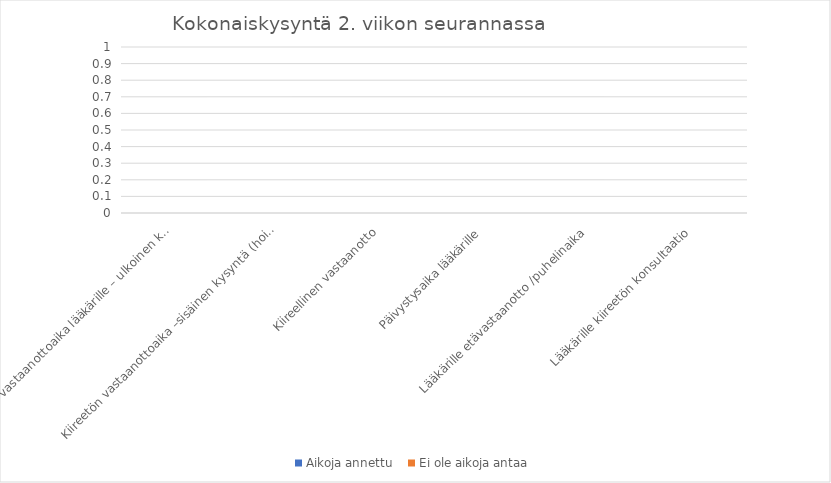
| Category | Aikoja annettu  | Ei ole aikoja antaa |
|---|---|---|
| Kiireetön vastaanottoaika lääkärille – ulkoinen kysyntä (hta:sta varattu aika) | 0 | 0 |
| Kiireetön vastaanottoaika –sisäinen kysyntä (hoitajan vastaanotolta/jatkokäynti) | 0 | 0 |
| Kiireellinen vastaanotto | 0 | 0 |
| Päivystysaika lääkärille | 0 | 0 |
| Lääkärille etävastaanotto /puhelinaika | 0 | 0 |
| Lääkärille kiireetön konsultaatio | 0 | 0 |